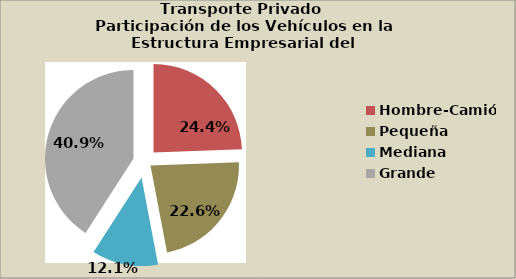
| Category | Series 0 |
|---|---|
| Hombre-Camión | 24.404 |
| Pequeña | 22.572 |
| Mediana | 12.1 |
| Grande | 40.865 |